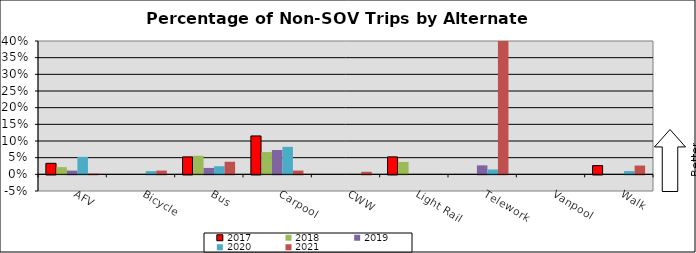
| Category | 2017 | 2018 | 2019 | 2020 | 2021 |
|---|---|---|---|---|---|
| AFV | 0.033 | 0.022 | 0.011 | 0.052 | 0.002 |
| Bicycle | 0 | 0 | 0 | 0.01 | 0.011 |
| Bus | 0.052 | 0.056 | 0.019 | 0.024 | 0.038 |
| Carpool | 0.115 | 0.067 | 0.073 | 0.083 | 0.011 |
| CWW | 0 | 0 | 0 | 0 | 0.008 |
| Light Rail | 0.052 | 0.037 | 0 | 0 | 0 |
| Telework | 0 | 0 | 0.027 | 0.015 | 0.634 |
| Vanpool | 0 | 0 | 0 | 0 | 0 |
| Walk | 0.026 | 0 | 0 | 0.01 | 0.026 |